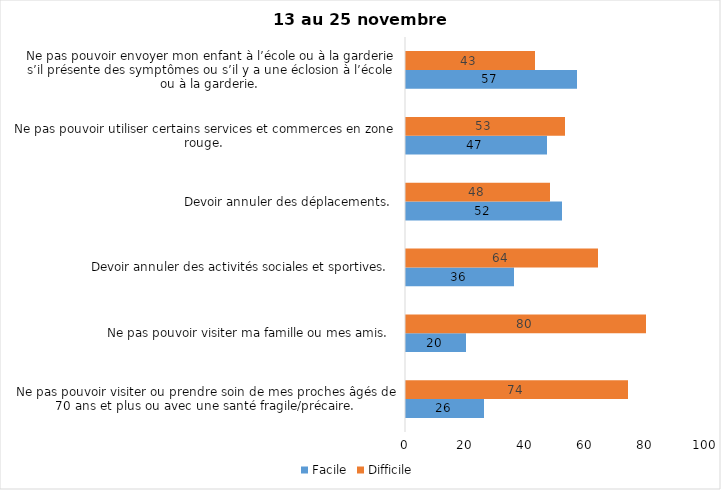
| Category | Facile | Difficile |
|---|---|---|
| Ne pas pouvoir visiter ou prendre soin de mes proches âgés de 70 ans et plus ou avec une santé fragile/précaire.  | 26 | 74 |
| Ne pas pouvoir visiter ma famille ou mes amis.  | 20 | 80 |
| Devoir annuler des activités sociales et sportives.  | 36 | 64 |
| Devoir annuler des déplacements.  | 52 | 48 |
| Ne pas pouvoir utiliser certains services et commerces en zone rouge.  | 47 | 53 |
| Ne pas pouvoir envoyer mon enfant à l’école ou à la garderie s’il présente des symptômes ou s’il y a une éclosion à l’école ou à la garderie.  | 57 | 43 |